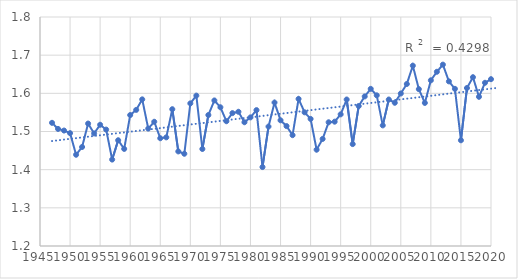
| Category | HIGH |
|---|---|
| 1947.0 | 1.523 |
| 1948.0 | 1.507 |
| 1949.0 | 1.503 |
| 1950.0 | 1.496 |
| 1951.0 | 1.439 |
| 1952.0 | 1.459 |
| 1953.0 | 1.521 |
| 1954.0 | 1.495 |
| 1955.0 | 1.518 |
| 1956.0 | 1.505 |
| 1957.0 | 1.426 |
| 1958.0 | 1.477 |
| 1959.0 | 1.454 |
| 1960.0 | 1.543 |
| 1961.0 | 1.557 |
| 1962.0 | 1.584 |
| 1963.0 | 1.508 |
| 1964.0 | 1.526 |
| 1965.0 | 1.482 |
| 1966.0 | 1.485 |
| 1967.0 | 1.558 |
| 1968.0 | 1.448 |
| 1969.0 | 1.442 |
| 1970.0 | 1.574 |
| 1971.0 | 1.594 |
| 1972.0 | 1.454 |
| 1973.0 | 1.543 |
| 1974.0 | 1.581 |
| 1975.0 | 1.564 |
| 1976.0 | 1.527 |
| 1977.0 | 1.548 |
| 1978.0 | 1.552 |
| 1979.0 | 1.524 |
| 1980.0 | 1.537 |
| 1981.0 | 1.556 |
| 1982.0 | 1.407 |
| 1983.0 | 1.513 |
| 1984.0 | 1.576 |
| 1985.0 | 1.529 |
| 1986.0 | 1.514 |
| 1987.0 | 1.49 |
| 1988.0 | 1.585 |
| 1989.0 | 1.55 |
| 1990.0 | 1.533 |
| 1991.0 | 1.452 |
| 1992.0 | 1.481 |
| 1993.0 | 1.524 |
| 1994.0 | 1.526 |
| 1995.0 | 1.545 |
| 1996.0 | 1.584 |
| 1997.0 | 1.467 |
| 1998.0 | 1.567 |
| 1999.0 | 1.592 |
| 2000.0 | 1.612 |
| 2001.0 | 1.595 |
| 2002.0 | 1.516 |
| 2003.0 | 1.584 |
| 2004.0 | 1.575 |
| 2005.0 | 1.6 |
| 2006.0 | 1.624 |
| 2007.0 | 1.672 |
| 2008.0 | 1.611 |
| 2009.0 | 1.575 |
| 2010.0 | 1.634 |
| 2011.0 | 1.656 |
| 2012.0 | 1.675 |
| 2013.0 | 1.631 |
| 2014.0 | 1.612 |
| 2015.0 | 1.477 |
| 2016.0 | 1.614 |
| 2017.0 | 1.642 |
| 2018.0 | 1.591 |
| 2019.0 | 1.628 |
| 2020.0 | 1.637 |
| 2021.0 | 1.642 |